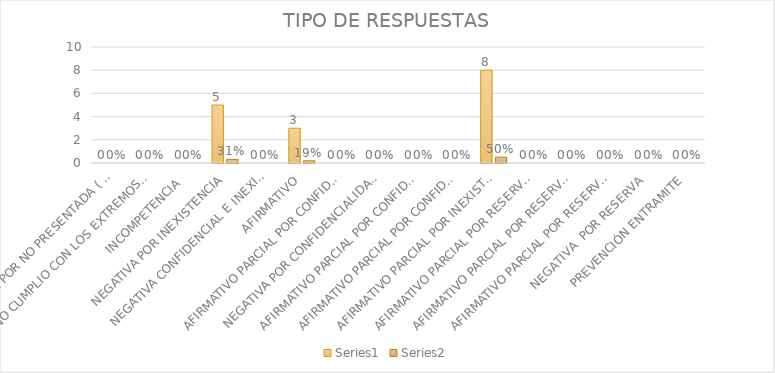
| Category | Series 4 | Series 5 |
|---|---|---|
| SE TIENE POR NO PRESENTADA ( NO CUMPLIÓ PREVENCIÓN) | 0 | 0 |
| NO CUMPLIO CON LOS EXTREMOS DEL ARTÍCULO 79 (REQUISITOS) | 0 | 0 |
| INCOMPETENCIA  | 0 | 0 |
| NEGATIVA POR INEXISTENCIA | 5 | 0.312 |
| NEGATIVA CONFIDENCIAL E INEXISTENTE | 0 | 0 |
| AFIRMATIVO | 3 | 0.188 |
| AFIRMATIVO PARCIAL POR CONFIDENCIALIDAD  | 0 | 0 |
| NEGATIVA POR CONFIDENCIALIDAD Y RESERVADA | 0 | 0 |
| AFIRMATIVO PARCIAL POR CONFIDENCIALIDAD E INEXISTENCIA | 0 | 0 |
| AFIRMATIVO PARCIAL POR CONFIDENCIALIDAD, RESERVA E INEXISTENCIA | 0 | 0 |
| AFIRMATIVO PARCIAL POR INEXISTENCIA | 8 | 0.5 |
| AFIRMATIVO PARCIAL POR RESERVA | 0 | 0 |
| AFIRMATIVO PARCIAL POR RESERVA Y CONFIDENCIALIDAD | 0 | 0 |
| AFIRMATIVO PARCIAL POR RESERVA E INEXISTENCIA | 0 | 0 |
| NEGATIVA  POR RESERVA | 0 | 0 |
| PREVENCIÓN ENTRAMITE | 0 | 0 |